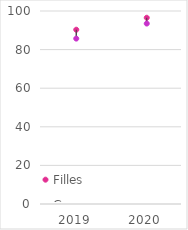
| Category | Filles | Garçons |
|---|---|---|
| 2019.0 | 90.3 | 85.7 |
| 2020.0 | 96.5 | 93.5 |